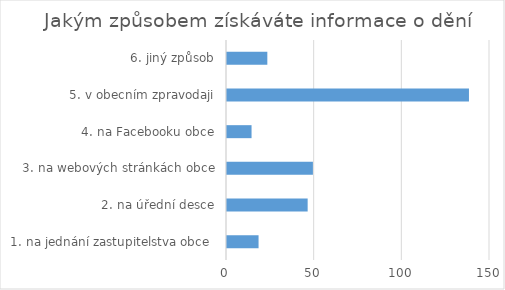
| Category | Series 0 |
|---|---|
| 1. na jednání zastupitelstva obce  | 18 |
| 2. na úřední desce | 46 |
| 3. na webových stránkách obce | 49 |
| 4. na Facebooku obce | 14 |
| 5. v obecním zpravodaji | 138 |
| 6. jiný způsob | 23 |